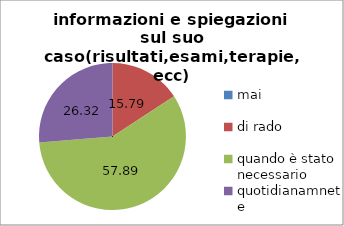
| Category | informazioni e spiegazioni sul suo caso(risultati,esami,terapie,ecc) |
|---|---|
| mai | 0 |
| di rado | 15.789 |
| quando è stato necessario | 57.895 |
| quotidianamnete | 26.316 |